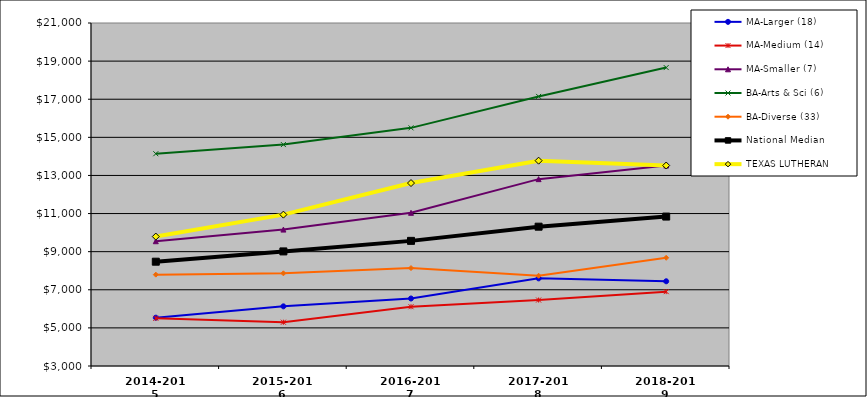
| Category | MA-Larger (18) | MA-Medium (14) | MA-Smaller (7) | BA-Arts & Sci (6) | BA-Diverse (33) | National Median |  TEXAS LUTHERAN  |
|---|---|---|---|---|---|---|---|
| 2014-2015 | 5536.137 | 5503.658 | 9547.51 | 14139.76 | 7793.906 | 8473.314 | 9792.02 |
| 2015-2016 | 6131.064 | 5297.342 | 10158.742 | 14619.957 | 7862.544 | 9013.486 | 10943.363 |
| 2016-2017 | 6542.111 | 6109.426 | 11039.573 | 15497.624 | 8140.18 | 9566.64 | 12600.824 |
| 2017-2018 | 7598.462 | 6461.311 | 12805.612 | 17147.529 | 7736.092 | 10311.147 | 13775.86 |
| 2018-2019 | 7446.505 | 6902.119 | 13521.7 | 18661.438 | 8678.413 | 10842.044 | 13520.988 |